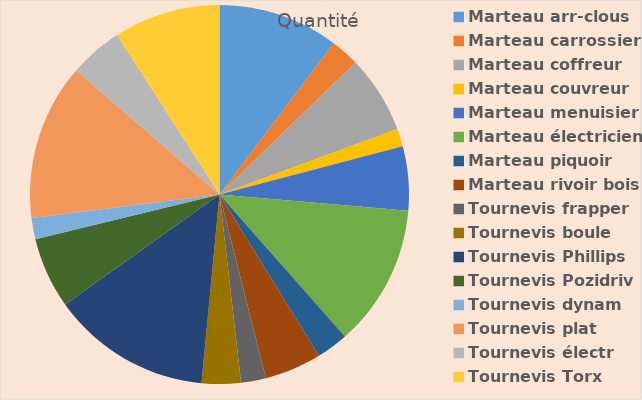
| Category | Quantité |
|---|---|
| Marteau arr-clous | 34 |
| Marteau carrossier | 8 |
| Marteau coffreur | 22 |
| Marteau couvreur | 5 |
| Marteau menuisier | 18 |
| Marteau électricien | 40 |
| Marteau piquoir | 9 |
| Marteau rivoir bois | 16 |
| Tournevis frapper | 7 |
| Tournevis boule | 11 |
| Tournevis Phillips | 45 |
| Tournevis Pozidriv | 20 |
| Tournevis dynam | 6 |
| Tournevis plat | 44 |
| Tournevis électr | 15 |
| Tournevis Torx | 30 |